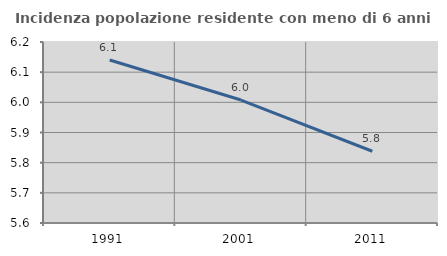
| Category | Incidenza popolazione residente con meno di 6 anni |
|---|---|
| 1991.0 | 6.14 |
| 2001.0 | 6.008 |
| 2011.0 | 5.838 |